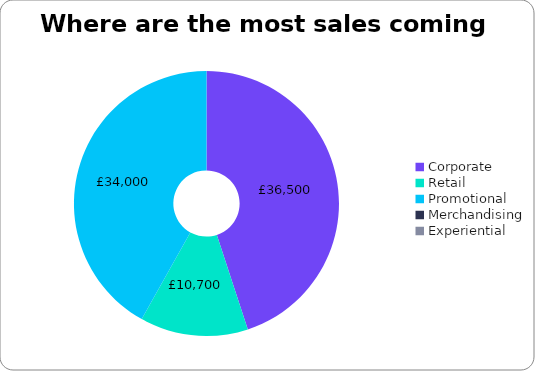
| Category | Series 0 |
|---|---|
| Corporate | 36500 |
| Retail | 10700 |
| Promotional | 34000 |
| Merchandising | 0 |
| Experiential | 0 |